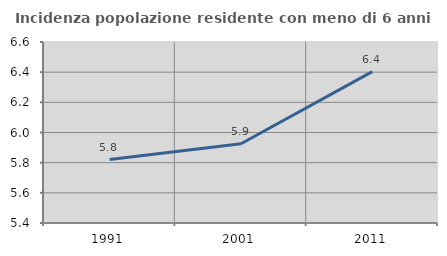
| Category | Incidenza popolazione residente con meno di 6 anni |
|---|---|
| 1991.0 | 5.821 |
| 2001.0 | 5.926 |
| 2011.0 | 6.403 |